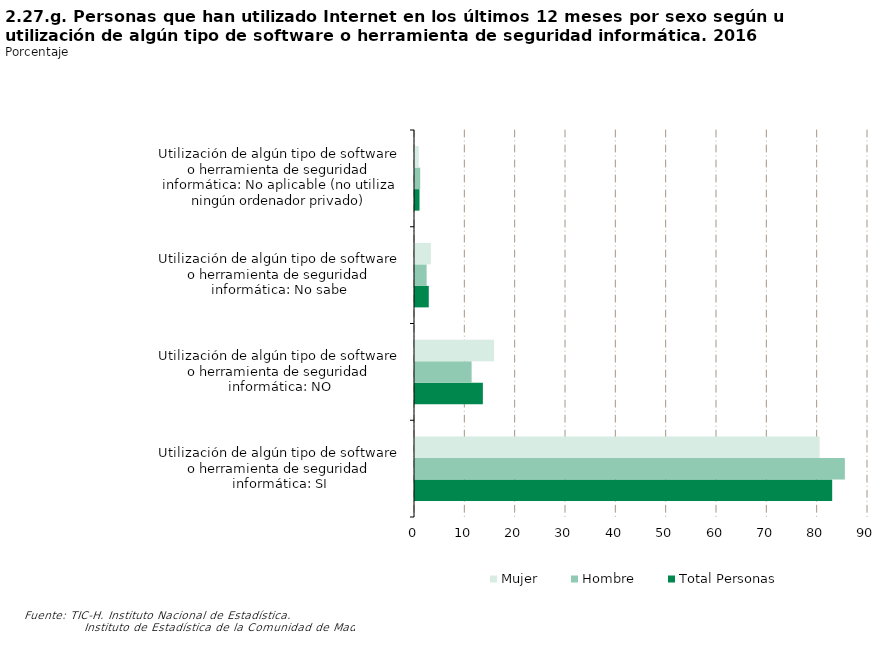
| Category | Total Personas | Hombre | Mujer |
|---|---|---|---|
| Utilización de algún tipo de software o herramienta de seguridad informática: SI | 82.887 | 85.401 | 80.377 |
| Utilización de algún tipo de software o herramienta de seguridad informática: NO | 13.483 | 11.249 | 15.714 |
| Utilización de algún tipo de software o herramienta de seguridad informática: No sabe | 2.734 | 2.31 | 3.158 |
| Utilización de algún tipo de software o herramienta de seguridad informática: No aplicable (no utiliza ningún ordenador privado) | 0.895 | 1.04 | 0.751 |